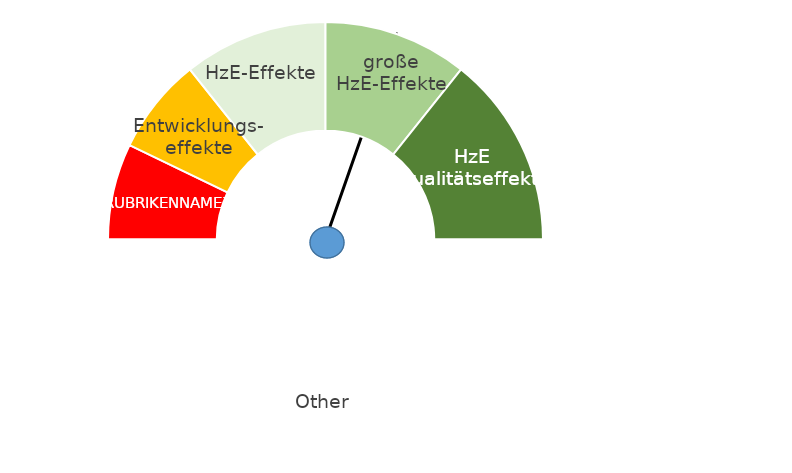
| Category | Series 0 |
|---|---|
| nan | 1.214 |
| 0.65 | 0 |
| nan | 0.786 |
| nan | 2 |